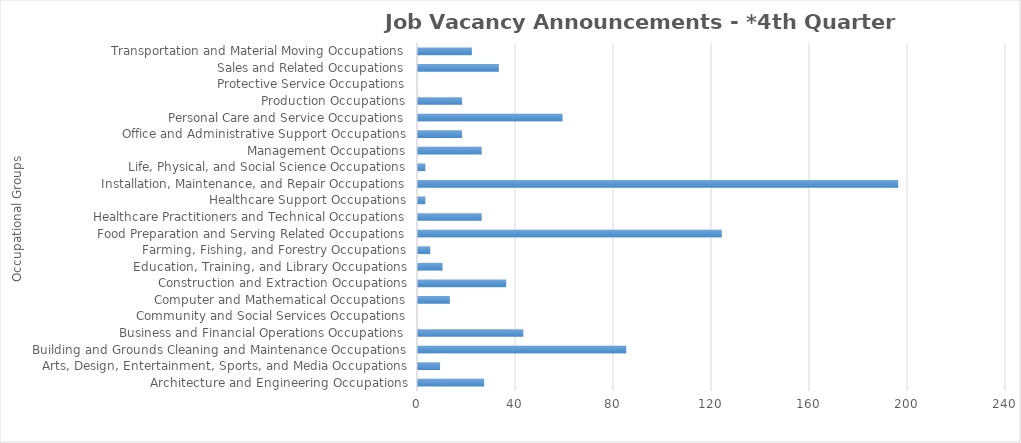
| Category | Total JVAs |
|---|---|
| Architecture and Engineering Occupations | 27 |
| Arts, Design, Entertainment, Sports, and Media Occupations | 9 |
| Building and Grounds Cleaning and Maintenance Occupations | 85 |
| Business and Financial Operations Occupations | 43 |
| Community and Social Services Occupations | 0 |
| Computer and Mathematical Occupations | 13 |
| Construction and Extraction Occupations | 36 |
| Education, Training, and Library Occupations | 10 |
| Farming, Fishing, and Forestry Occupations | 5 |
| Food Preparation and Serving Related Occupations | 124 |
| Healthcare Practitioners and Technical Occupations | 26 |
| Healthcare Support Occupations | 3 |
| Installation, Maintenance, and Repair Occupations | 196 |
| Life, Physical, and Social Science Occupations | 3 |
| Management Occupations | 26 |
| Office and Administrative Support Occupations | 18 |
| Personal Care and Service Occupations | 59 |
| Production Occupations | 18 |
| Protective Service Occupations | 0 |
| Sales and Related Occupations | 33 |
| Transportation and Material Moving Occupations | 22 |